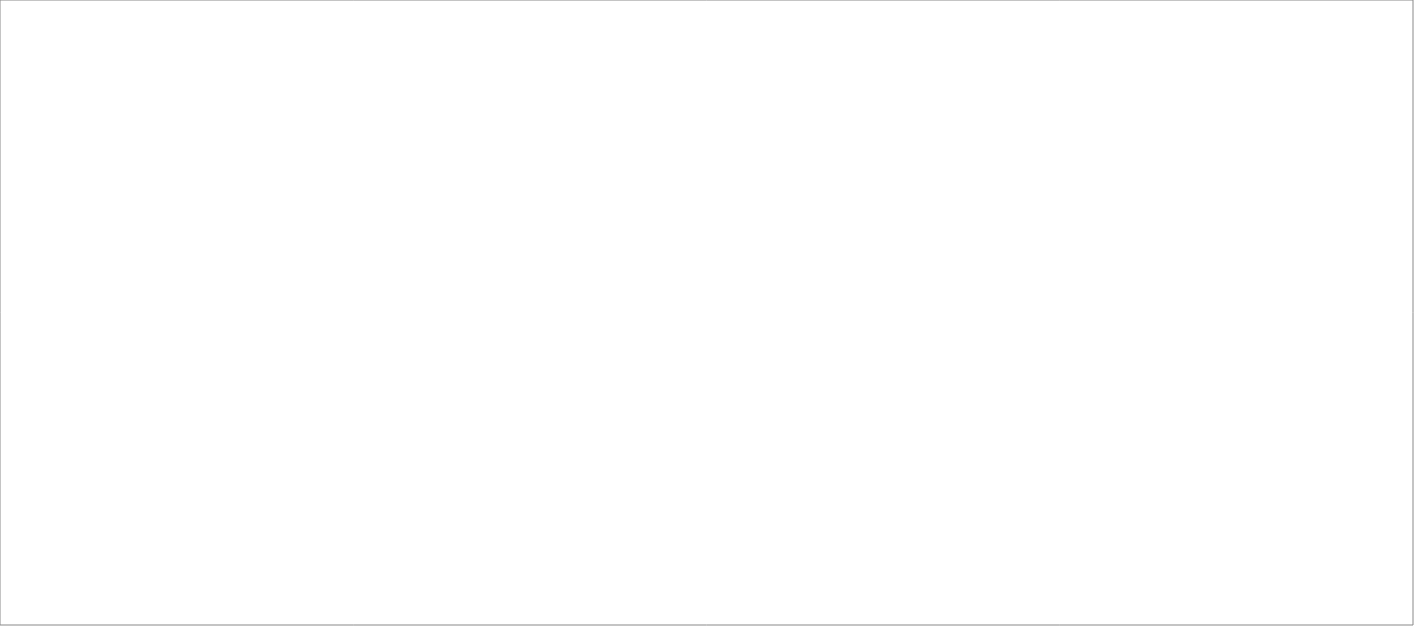
| Category | Total |
|---|---|
| Poolia Sverige AB | 85 |
| Experis AB | 45 |
| Lisberg Sverige AB | 25 |
| Source Executive Recruitment Sweden AB | 25 |